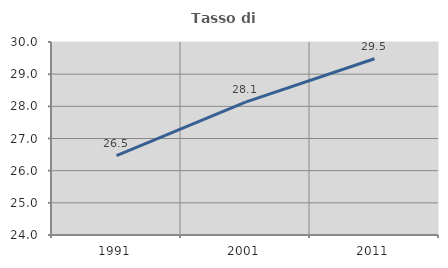
| Category | Tasso di occupazione   |
|---|---|
| 1991.0 | 26.468 |
| 2001.0 | 28.13 |
| 2011.0 | 29.48 |